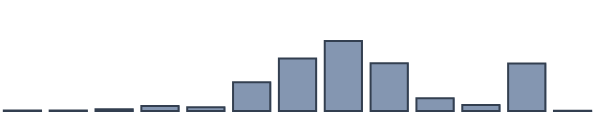
| Category | Series 0 |
|---|---|
| 0 | 0.216 |
| 1 | 0.187 |
| 2 | 0.666 |
| 3 | 1.842 |
| 4 | 1.387 |
| 5 | 10.388 |
| 6 | 18.938 |
| 7 | 25.257 |
| 8 | 17.203 |
| 9 | 4.599 |
| 10 | 2.127 |
| 11 | 17.139 |
| 12 | 0.052 |